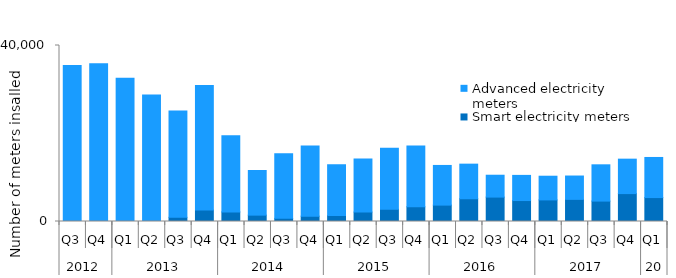
| Category | Smart electricity meters | Advanced electricity meters |
|---|---|---|
| 0 | 0 | 35455 |
| 1 | 0 | 35834 |
| 2 | 0 | 32529 |
| 3 | 0 | 28722 |
| 4 | 946 | 24189 |
| 5 | 2590 | 28300 |
| 6 | 2175 | 17332 |
| 7 | 1445 | 10152 |
| 8 | 714 | 14700 |
| 9 | 1214 | 15955 |
| 10 | 1369 | 11534 |
| 11 | 2137 | 12073 |
| 12 | 2767 | 13888 |
| 13 | 3347 | 13832 |
| 14 | 3725 | 9015 |
| 15 | 5170 | 7865 |
| 16 | 5545 | 4972 |
| 17 | 4764 | 5716 |
| 18 | 4906 | 5385 |
| 19 | 5029 | 5307 |
| 20 | 4636 | 8248 |
| 21 | 6344 | 7825 |
| 22 | 5439 | 9114 |